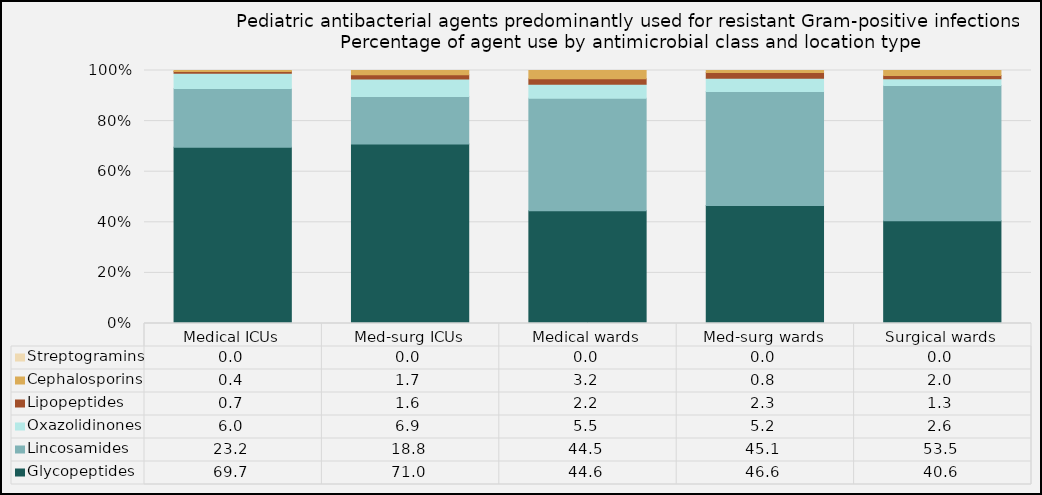
| Category | Glycopeptides | Lincosamides | Oxazolidinones | Lipopeptides | Cephalosporins | Streptogramins |
|---|---|---|---|---|---|---|
| Medical ICUs | 69.66 | 23.23 | 6 | 0.74 | 0.37 | 0 |
| Med-surg ICUs | 70.98 | 18.79 | 6.91 | 1.64 | 1.68 | 0 |
| Medical wards | 44.57 | 44.5 | 5.51 | 2.2 | 3.22 | 0 |
| Med-surg wards | 46.6 | 45.09 | 5.24 | 2.26 | 0.8 | 0 |
| Surgical wards | 40.57 | 53.54 | 2.61 | 1.31 | 1.97 | 0 |